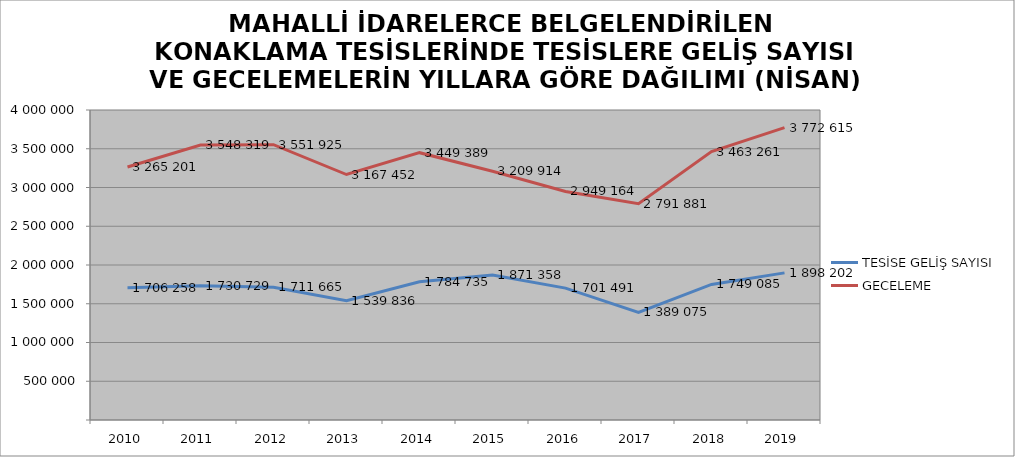
| Category | TESİSE GELİŞ SAYISI | GECELEME |
|---|---|---|
| 2010 | 1706258 | 3265201 |
| 2011 | 1730729 | 3548319 |
| 2012 | 1711665 | 3551925 |
| 2013 | 1539836 | 3167452 |
| 2014 | 1784735 | 3449389 |
| 2015 | 1871358 | 3209914 |
| 2016 | 1701491 | 2949164 |
| 2017 | 1389075 | 2791881 |
| 2018 | 1749085 | 3463261 |
| 2019 | 1898202 | 3772615 |